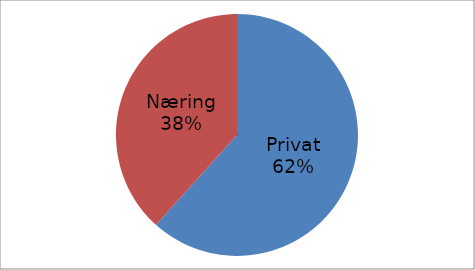
| Category | Series 0 |
|---|---|
| Privat | 33384597 |
| Næring | 20744107 |